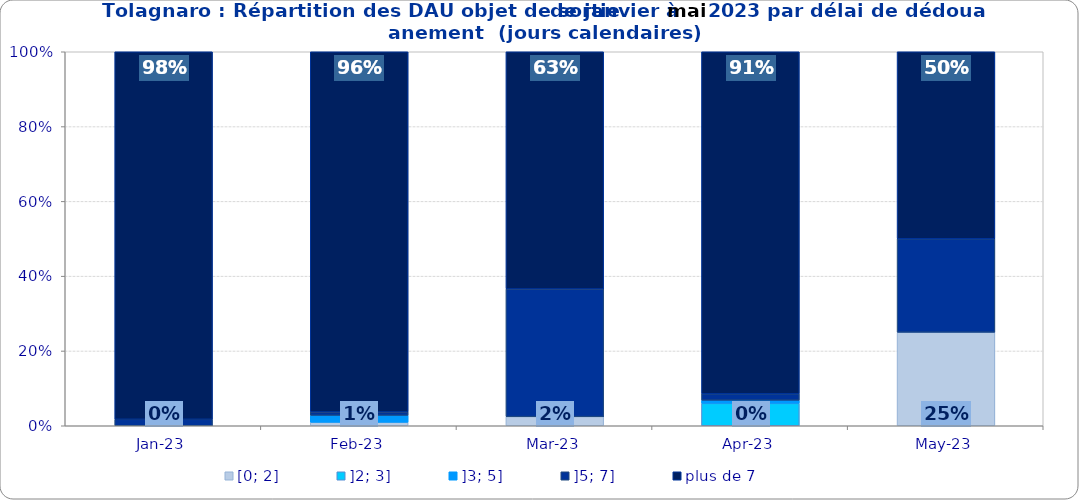
| Category | [0; 2] | ]2; 3] | ]3; 5] | ]5; 7] | plus de 7 |
|---|---|---|---|---|---|
| 2023-01-01 | 0 | 0 | 0 | 0.017 | 0.983 |
| 2023-02-01 | 0.009 | 0 | 0.019 | 0.009 | 0.963 |
| 2023-03-01 | 0.024 | 0 | 0 | 0.341 | 0.634 |
| 2023-04-01 | 0 | 0.06 | 0.009 | 0.017 | 0.915 |
| 2023-05-01 | 0.25 | 0 | 0 | 0.25 | 0.5 |